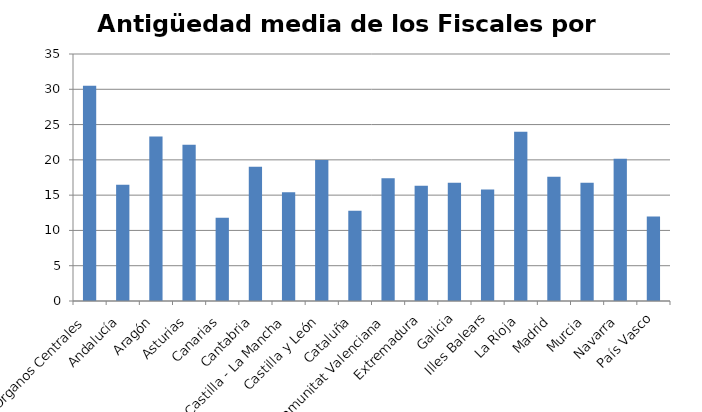
| Category | Series 0 |
|---|---|
| Órganos Centrales | 30.5 |
| Andalucía | 16.49 |
| Aragón | 23.31 |
| Asturias | 22.13 |
| Canarias | 11.79 |
| Cantabria | 19.04 |
| Castilla - La Mancha | 15.41 |
| Castilla y León | 19.98 |
| Cataluña | 12.78 |
| Comunitat Valenciana | 17.41 |
| Extremadura | 16.32 |
| Galicia | 16.76 |
| Illes Balears | 15.81 |
| La Rioja | 24 |
| Madrid | 17.6 |
| Murcia | 16.76 |
| Navarra | 20.14 |
| País Vasco | 11.97 |